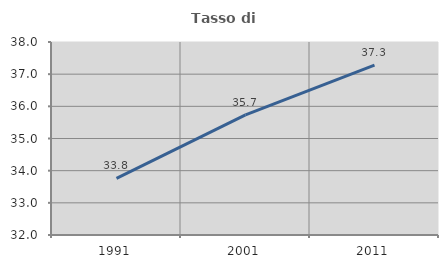
| Category | Tasso di occupazione   |
|---|---|
| 1991.0 | 33.762 |
| 2001.0 | 35.737 |
| 2011.0 | 37.281 |